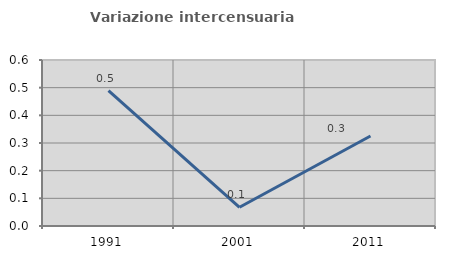
| Category | Variazione intercensuaria annua |
|---|---|
| 1991.0 | 0.489 |
| 2001.0 | 0.068 |
| 2011.0 | 0.325 |